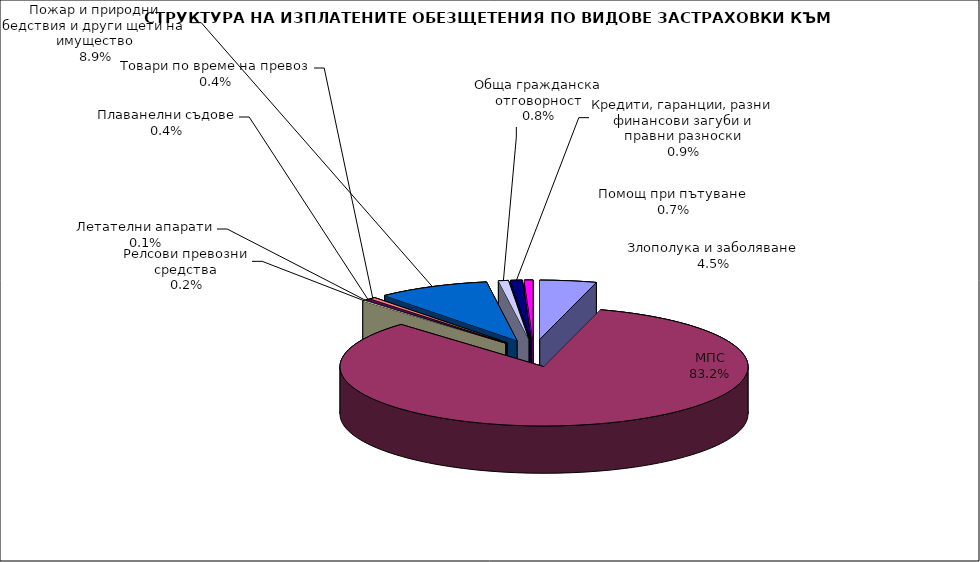
| Category | Series 0 |
|---|---|
| Злополука и заболяване | 0.045 |
| МПС | 0.832 |
| Релсови превозни средства | 0.002 |
| Летателни апарати | 0.001 |
| Плаванелни съдове | 0.004 |
| Товари по време на превоз | 0.004 |
| Пожар и природни бедствия и други щети на имущество | 0.089 |
| Обща гражданска отговорност | 0.008 |
| Кредити, гаранции, разни финансови загуби и правни разноски | 0.009 |
| Помощ при пътуване | 0.007 |